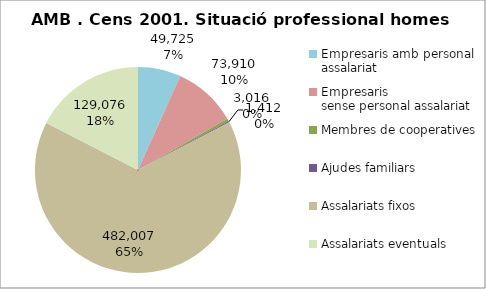
| Category | Series 0 |
|---|---|
| Empresaris amb personal assalariat | 49725 |
| Empresaris
sense personal assalariat | 73910 |
| Membres de cooperatives | 3016 |
| Ajudes familiars | 1412 |
| Assalariats fixos | 482007 |
| Assalariats eventuals | 129076 |